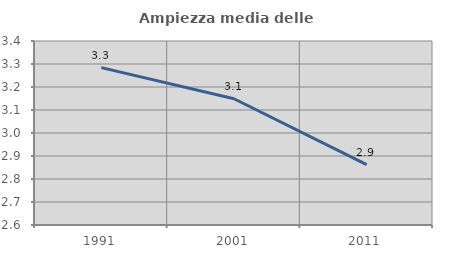
| Category | Ampiezza media delle famiglie |
|---|---|
| 1991.0 | 3.284 |
| 2001.0 | 3.149 |
| 2011.0 | 2.862 |